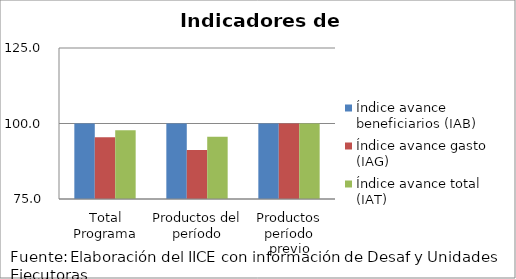
| Category | Índice avance beneficiarios (IAB)  | Índice avance gasto (IAG) | Índice avance total (IAT)  |
|---|---|---|---|
| Total Programa | 100 | 95.454 | 97.727 |
| Productos del período | 100 | 91.184 | 95.592 |
| Productos período previo | 100 | 100 | 100 |